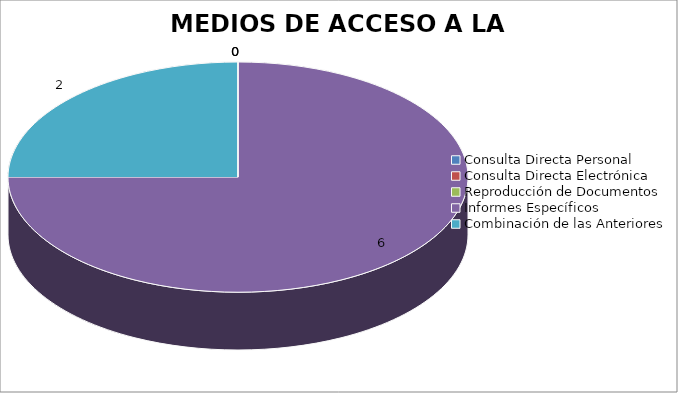
| Category | MEDIOS DE ACCESO A LA INFORMACIÓN |
|---|---|
| 0 | 0 |
| 1 | 0 |
| 2 | 0 |
| 3 | 6 |
| 4 | 2 |